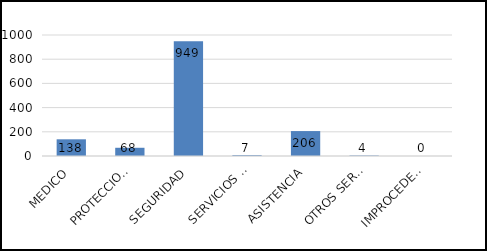
| Category | TOTAL |
|---|---|
| MEDICO | 138 |
| PROTECCION CIVIL | 68 |
| SEGURIDAD | 949 |
| SERVICIOS PUBLICOS | 7 |
| ASISTENCIA | 206 |
| OTROS SERVICIOS | 4 |
| IMPROCEDENTES | 0 |